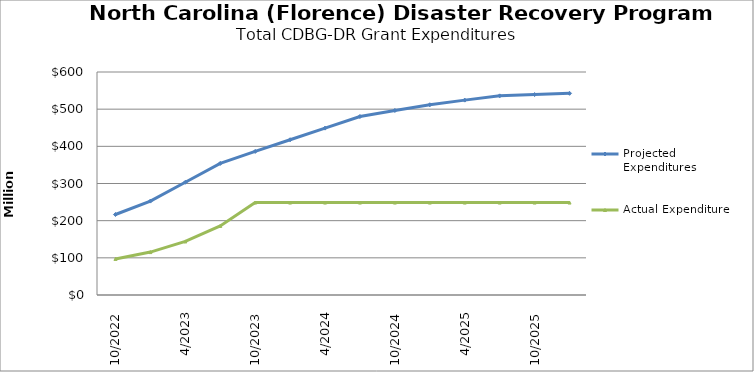
| Category | Projected Expenditures | Actual Expenditure |
|---|---|---|
| 10/2022 | 216539624 | 97038031.57 |
| 1/2023 | 252635178 | 115470991.82 |
| 4/2023 | 303343340 | 144044662.26 |
| 7/2023 | 354051503 | 185767599.96 |
| 10/2023 | 386313634 | 248673756.69 |
| 1/2024 | 417715425 | 248673756.69 |
| 4/2024 | 448977556 | 248673756.69 |
| 7/2024 | 480239687 | 248673756.69 |
| 10/2024 | 496579108 | 248673756.69 |
| 1/2025 | 511833241 | 248673756.69 |
| 4/2025 | 524300594 | 248673756.69 |
| 7/2025 | 535841507 | 248673756.69 |
| 10/2025 | 539242750 | 248673756.69 |
| 1/2026 | 542644000 | 248673756.69 |